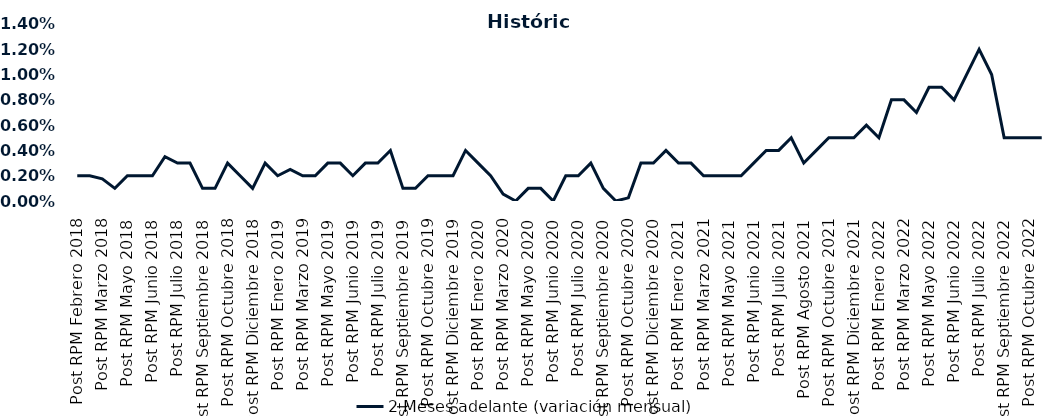
| Category | 2 Meses adelante (variación mensual) |
|---|---|
| Post RPM Febrero 2018 | 0.002 |
| Pre RPM Marzo 2018 | 0.002 |
| Post RPM Marzo 2018 | 0.002 |
| Pre RPM Mayo 2018 | 0.001 |
| Post RPM Mayo 2018 | 0.002 |
| Pre RPM Junio 2018 | 0.002 |
| Post RPM Junio 2018 | 0.002 |
| Pre RPM Julio 2018 | 0.004 |
| Post RPM Julio 2018 | 0.003 |
| Pre RPM Septiembre 2018 | 0.003 |
| Post RPM Septiembre 2018 | 0.001 |
| Pre RPM Octubre 2018 | 0.001 |
| Post RPM Octubre 2018 | 0.003 |
| Pre RPM Diciembre 2018 | 0.002 |
| Post RPM Diciembre 2018 | 0.001 |
| Pre RPM Enero 2019 | 0.003 |
| Post RPM Enero 2019 | 0.002 |
| Pre RPM Marzo 2019 | 0.002 |
| Post RPM Marzo 2019 | 0.002 |
| Pre RPM Mayo 2019 | 0.002 |
| Post RPM Mayo 2019 | 0.003 |
| Pre RPM Junio 2019 | 0.003 |
| Post RPM Junio 2019 | 0.002 |
| Pre RPM Julio 2019 | 0.003 |
| Post RPM Julio 2019 | 0.003 |
| Pre RPM Septiembre 2019 | 0.004 |
| Post RPM Septiembre 2019 | 0.001 |
| Pre RPM Octubre 2019 | 0.001 |
| Post RPM Octubre 2019 | 0.002 |
| Pre RPM Diciembre 2019 | 0.002 |
| Post RPM Diciembre 2019 | 0.002 |
| Pre RPM Enero 2020 | 0.004 |
| Post RPM Enero 2020 | 0.003 |
| Pre RPM Marzo 2020 | 0.002 |
| Post RPM Marzo 2020 | 0.001 |
| Pre RPM Mayo 2020 | 0 |
| Post RPM Mayo 2020 | 0.001 |
| Pre RPM Junio 2020 | 0.001 |
| Post RPM Junio 2020 | 0 |
| Pre RPM Julio 2020 | 0.002 |
| Post RPM Julio 2020 | 0.002 |
| Pre RPM Septiembre 2020 | 0.003 |
| Post RPM Septiembre 2020 | 0.001 |
| Pre RPM Octubre 2020 | 0 |
| Post RPM Octubre 2020 | 0 |
| Pre RPM Diciembre 2020 | 0.003 |
| Post RPM Diciembre 2020 | 0.003 |
| Pre RPM Enero 2021 | 0.004 |
| Post RPM Enero 2021 | 0.003 |
| Pre RPM Marzo 2021 | 0.003 |
| Post RPM Marzo 2021 | 0.002 |
| Pre RPM Mayo 2021 | 0.002 |
| Post RPM Mayo 2021 | 0.002 |
| Pre RPM Junio 2021 | 0.002 |
| Post RPM Junio 2021 | 0.003 |
| Pre RPM Julio 2021 | 0.004 |
| Post RPM Julio 2021 | 0.004 |
| Pre RPM Agosto 2021 | 0.005 |
| Post RPM Agosto 2021 | 0.003 |
| Pre RPM Octubre 2021 | 0.004 |
| Post RPM Octubre 2021 | 0.005 |
| Pre RPM Diciembre 2021 | 0.005 |
| Post RPM Diciembre 2021 | 0.005 |
| Pre RPM Enero 2022 | 0.006 |
| Post RPM Enero 2022 | 0.005 |
| Pre RPM Marzo 2022 | 0.008 |
| Post RPM Marzo 2022 | 0.008 |
| Pre RPM Mayo 2022 | 0.007 |
| Post RPM Mayo 2022 | 0.009 |
| Pre RPM Junio 2022 | 0.009 |
| Post RPM Junio 2022 | 0.008 |
| Pre RPM Julio 2022 | 0.01 |
| Post RPM Julio 2022 | 0.012 |
| Pre RPM Septiembre 2022 | 0.01 |
| Post RPM Septiembre 2022 | 0.005 |
| Pre RPM Octubre 2022 | 0.005 |
| Post RPM Octubre 2022 | 0.005 |
| Pre RPM Diciembre 2022 | 0.005 |